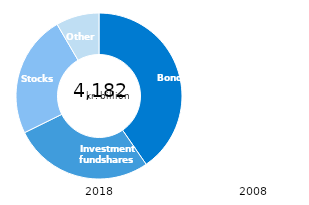
| Category | Series 0 |
|---|---|
| Bonds | 1689 |
| Investment fund shares | 1143 |
| Stocks | 998 |
| Other financial asstes | 352 |